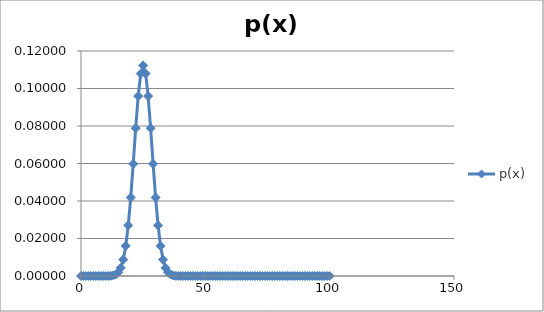
| Category | p(x) |
|---|---|
| 0.0 | 0 |
| 1.0 | 0 |
| 2.0 | 0 |
| 3.0 | 0 |
| 4.0 | 0 |
| 5.0 | 0 |
| 6.0 | 0 |
| 7.0 | 0 |
| 8.0 | 0 |
| 9.0 | 0 |
| 10.0 | 0 |
| 11.0 | 0 |
| 12.0 | 0 |
| 13.0 | 0 |
| 14.0 | 0.001 |
| 15.0 | 0.002 |
| 16.0 | 0.004 |
| 17.0 | 0.009 |
| 18.0 | 0.016 |
| 19.0 | 0.027 |
| 20.0 | 0.042 |
| 21.0 | 0.06 |
| 22.0 | 0.079 |
| 23.0 | 0.096 |
| 24.0 | 0.108 |
| 25.0 | 0.112 |
| 26.0 | 0.108 |
| 27.0 | 0.096 |
| 28.0 | 0.079 |
| 29.0 | 0.06 |
| 30.0 | 0.042 |
| 31.0 | 0.027 |
| 32.0 | 0.016 |
| 33.0 | 0.009 |
| 34.0 | 0.004 |
| 35.0 | 0.002 |
| 36.0 | 0.001 |
| 37.0 | 0 |
| 38.0 | 0 |
| 39.0 | 0 |
| 40.0 | 0 |
| 41.0 | 0 |
| 42.0 | 0 |
| 43.0 | 0 |
| 44.0 | 0 |
| 45.0 | 0 |
| 46.0 | 0 |
| 47.0 | 0 |
| 48.0 | 0 |
| 49.0 | 0 |
| 50.0 | 0 |
| 51.0 | 0 |
| 52.0 | 0 |
| 53.0 | 0 |
| 54.0 | 0 |
| 55.0 | 0 |
| 56.0 | 0 |
| 57.0 | 0 |
| 58.0 | 0 |
| 59.0 | 0 |
| 60.0 | 0 |
| 61.0 | 0 |
| 62.0 | 0 |
| 63.0 | 0 |
| 64.0 | 0 |
| 65.0 | 0 |
| 66.0 | 0 |
| 67.0 | 0 |
| 68.0 | 0 |
| 69.0 | 0 |
| 70.0 | 0 |
| 71.0 | 0 |
| 72.0 | 0 |
| 73.0 | 0 |
| 74.0 | 0 |
| 75.0 | 0 |
| 76.0 | 0 |
| 77.0 | 0 |
| 78.0 | 0 |
| 79.0 | 0 |
| 80.0 | 0 |
| 81.0 | 0 |
| 82.0 | 0 |
| 83.0 | 0 |
| 84.0 | 0 |
| 85.0 | 0 |
| 86.0 | 0 |
| 87.0 | 0 |
| 88.0 | 0 |
| 89.0 | 0 |
| 90.0 | 0 |
| 91.0 | 0 |
| 92.0 | 0 |
| 93.0 | 0 |
| 94.0 | 0 |
| 95.0 | 0 |
| 96.0 | 0 |
| 97.0 | 0 |
| 98.0 | 0 |
| 99.0 | 0 |
| 100.0 | 0 |